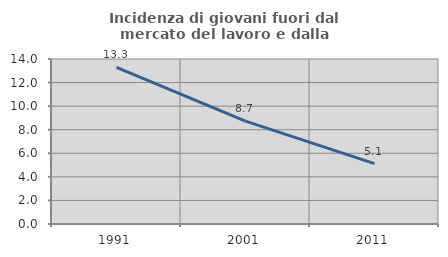
| Category | Incidenza di giovani fuori dal mercato del lavoro e dalla formazione  |
|---|---|
| 1991.0 | 13.291 |
| 2001.0 | 8.725 |
| 2011.0 | 5.128 |